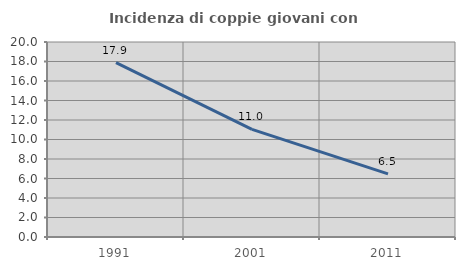
| Category | Incidenza di coppie giovani con figli |
|---|---|
| 1991.0 | 17.885 |
| 2001.0 | 11.032 |
| 2011.0 | 6.471 |